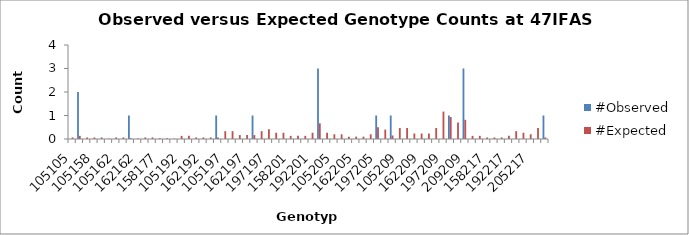
| Category | #Observed | #Expected |
|---|---|---|
| 105105.0 | 0 | 0.067 |
| 105115.0 | 2 | 0.133 |
| 115115.0 | 0 | 0.067 |
| 105158.0 | 0 | 0.067 |
| 115158.0 | 0 | 0.067 |
| 158158.0 | 0 | 0.017 |
| 105162.0 | 0 | 0.067 |
| 115162.0 | 0 | 0.067 |
| 158162.0 | 1 | 0.033 |
| 162162.0 | 0 | 0.017 |
| 105177.0 | 0 | 0.067 |
| 115177.0 | 0 | 0.067 |
| 158177.0 | 0 | 0.033 |
| 162177.0 | 0 | 0.033 |
| 177177.0 | 0 | 0.017 |
| 105192.0 | 0 | 0.133 |
| 115192.0 | 0 | 0.133 |
| 158192.0 | 0 | 0.067 |
| 162192.0 | 0 | 0.067 |
| 177192.0 | 0 | 0.067 |
| 192192.0 | 1 | 0.067 |
| 105197.0 | 0 | 0.333 |
| 115197.0 | 0 | 0.333 |
| 158197.0 | 0 | 0.167 |
| 162197.0 | 0 | 0.167 |
| 177197.0 | 1 | 0.167 |
| 192197.0 | 0 | 0.333 |
| 197197.0 | 0 | 0.417 |
| 105201.0 | 0 | 0.267 |
| 115201.0 | 0 | 0.267 |
| 158201.0 | 0 | 0.133 |
| 162201.0 | 0 | 0.133 |
| 177201.0 | 0 | 0.133 |
| 192201.0 | 0 | 0.267 |
| 197201.0 | 3 | 0.667 |
| 201201.0 | 0 | 0.267 |
| 105205.0 | 0 | 0.2 |
| 115205.0 | 0 | 0.2 |
| 158205.0 | 0 | 0.1 |
| 162205.0 | 0 | 0.1 |
| 177205.0 | 0 | 0.1 |
| 192205.0 | 0 | 0.2 |
| 197205.0 | 1 | 0.5 |
| 201205.0 | 0 | 0.4 |
| 205205.0 | 1 | 0.15 |
| 105209.0 | 0 | 0.467 |
| 115209.0 | 0 | 0.467 |
| 158209.0 | 0 | 0.233 |
| 162209.0 | 0 | 0.233 |
| 177209.0 | 0 | 0.233 |
| 192209.0 | 0 | 0.467 |
| 197209.0 | 0 | 1.167 |
| 201209.0 | 1 | 0.933 |
| 205209.0 | 0 | 0.7 |
| 209209.0 | 3 | 0.817 |
| 105217.0 | 0 | 0.133 |
| 115217.0 | 0 | 0.133 |
| 158217.0 | 0 | 0.067 |
| 162217.0 | 0 | 0.067 |
| 177217.0 | 0 | 0.067 |
| 192217.0 | 0 | 0.133 |
| 197217.0 | 0 | 0.333 |
| 201217.0 | 0 | 0.267 |
| 205217.0 | 0 | 0.2 |
| 209217.0 | 0 | 0.467 |
| 217217.0 | 1 | 0.067 |